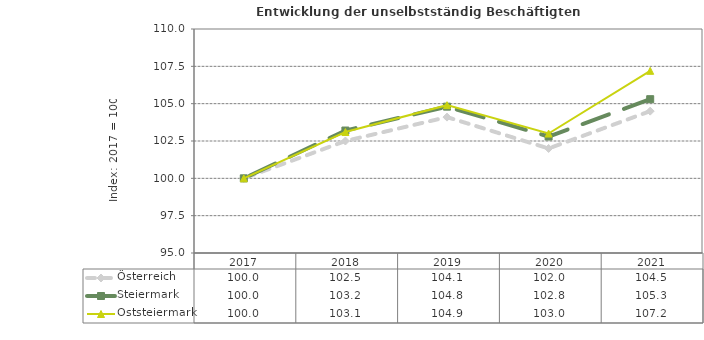
| Category | Österreich | Steiermark | Oststeiermark |
|---|---|---|---|
| 2021.0 | 104.5 | 105.3 | 107.2 |
| 2020.0 | 102 | 102.8 | 103 |
| 2019.0 | 104.1 | 104.8 | 104.9 |
| 2018.0 | 102.5 | 103.2 | 103.1 |
| 2017.0 | 100 | 100 | 100 |